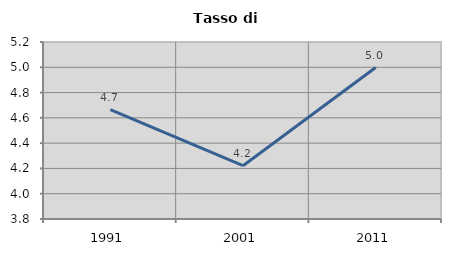
| Category | Tasso di disoccupazione   |
|---|---|
| 1991.0 | 4.666 |
| 2001.0 | 4.222 |
| 2011.0 | 4.998 |